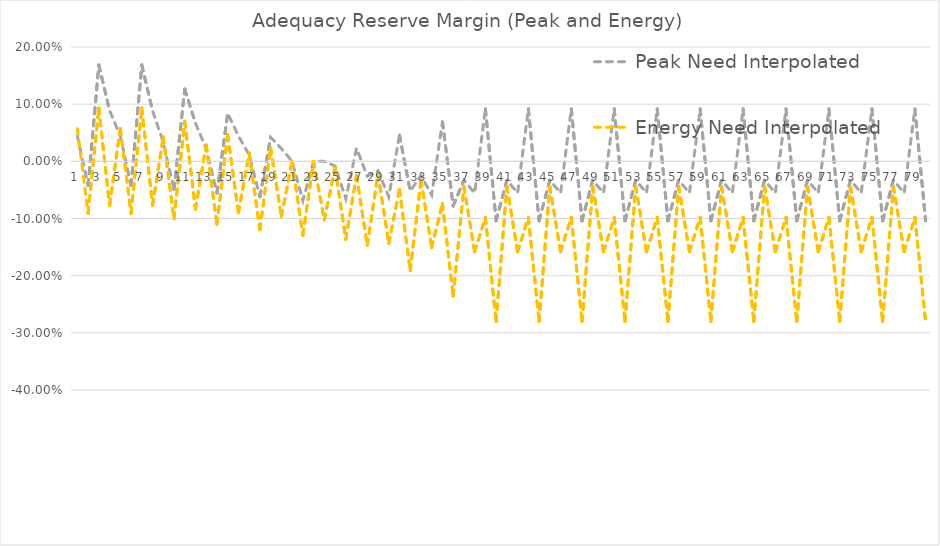
| Category | Peak Need Interpolated | Energy Need Interpolated |
|---|---|---|
| 0 | 0.044 | 0.057 |
| 1 | -0.042 | -0.091 |
| 2 | 0.168 | 0.093 |
| 3 | 0.089 | -0.077 |
| 4 | 0.044 | 0.057 |
| 5 | -0.042 | -0.091 |
| 6 | 0.168 | 0.093 |
| 7 | 0.089 | -0.077 |
| 8 | 0.033 | 0.043 |
| 9 | -0.049 | -0.101 |
| 10 | 0.126 | 0.07 |
| 11 | 0.067 | -0.084 |
| 12 | 0.022 | 0.029 |
| 13 | -0.056 | -0.11 |
| 14 | 0.084 | 0.047 |
| 15 | 0.044 | -0.09 |
| 16 | 0.011 | 0.014 |
| 17 | -0.062 | -0.12 |
| 18 | 0.042 | 0.023 |
| 19 | 0.022 | -0.096 |
| 20 | 0 | 0 |
| 21 | -0.069 | -0.129 |
| 22 | 0 | 0 |
| 23 | 0 | -0.103 |
| 24 | -0.008 | -0.011 |
| 25 | -0.065 | -0.137 |
| 26 | 0.023 | -0.025 |
| 27 | -0.026 | -0.147 |
| 28 | -0.016 | -0.022 |
| 29 | -0.062 | -0.144 |
| 30 | 0.046 | -0.049 |
| 31 | -0.052 | -0.192 |
| 32 | -0.025 | -0.033 |
| 33 | -0.059 | -0.151 |
| 34 | 0.069 | -0.074 |
| 35 | -0.078 | -0.236 |
| 36 | -0.033 | -0.044 |
| 37 | -0.055 | -0.158 |
| 38 | 0.092 | -0.098 |
| 39 | -0.104 | -0.28 |
| 40 | -0.033 | -0.044 |
| 41 | -0.055 | -0.158 |
| 42 | 0.092 | -0.098 |
| 43 | -0.104 | -0.28 |
| 44 | -0.033 | -0.044 |
| 45 | -0.055 | -0.158 |
| 46 | 0.092 | -0.098 |
| 47 | -0.104 | -0.28 |
| 48 | -0.033 | -0.044 |
| 49 | -0.055 | -0.158 |
| 50 | 0.092 | -0.098 |
| 51 | -0.104 | -0.28 |
| 52 | -0.033 | -0.044 |
| 53 | -0.055 | -0.158 |
| 54 | 0.092 | -0.098 |
| 55 | -0.104 | -0.28 |
| 56 | -0.033 | -0.044 |
| 57 | -0.055 | -0.158 |
| 58 | 0.092 | -0.098 |
| 59 | -0.104 | -0.28 |
| 60 | -0.033 | -0.044 |
| 61 | -0.055 | -0.158 |
| 62 | 0.092 | -0.098 |
| 63 | -0.104 | -0.28 |
| 64 | -0.033 | -0.044 |
| 65 | -0.055 | -0.158 |
| 66 | 0.092 | -0.098 |
| 67 | -0.104 | -0.28 |
| 68 | -0.033 | -0.044 |
| 69 | -0.055 | -0.158 |
| 70 | 0.092 | -0.098 |
| 71 | -0.104 | -0.28 |
| 72 | -0.033 | -0.044 |
| 73 | -0.055 | -0.158 |
| 74 | 0.092 | -0.098 |
| 75 | -0.104 | -0.28 |
| 76 | -0.033 | -0.044 |
| 77 | -0.055 | -0.158 |
| 78 | 0.092 | -0.098 |
| 79 | -0.104 | -0.28 |